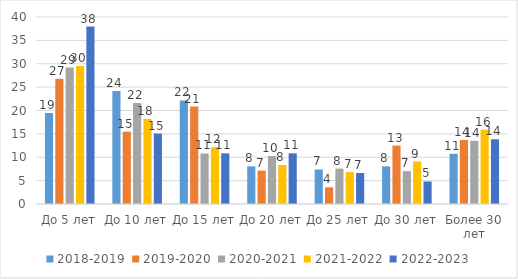
| Category | 2018-2019 | 2019-2020 | 2020-2021 | 2021-2022 | 2022-2023 |
|---|---|---|---|---|---|
| До 5 лет | 19.463 | 26.786 | 29.189 | 29.545 | 37.952 |
| До 10 лет | 24.161 | 15.476 | 21.622 | 18.182 | 15.06 |
| До 15 лет | 22.148 | 20.833 | 10.811 | 12.121 | 10.843 |
| До 20 лет | 8.054 | 7.143 | 10.27 | 8.333 | 10.843 |
| До 25 лет | 7.383 | 3.571 | 7.568 | 6.818 | 6.627 |
| До 30 лет | 8.054 | 12.5 | 7.027 | 9.091 | 4.819 |
| Более 30 лет | 10.738 | 13.69 | 13.514 | 15.909 | 13.855 |